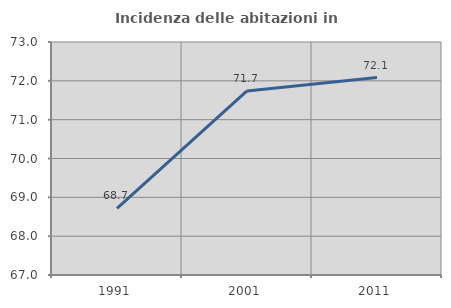
| Category | Incidenza delle abitazioni in proprietà  |
|---|---|
| 1991.0 | 68.717 |
| 2001.0 | 71.74 |
| 2011.0 | 72.085 |